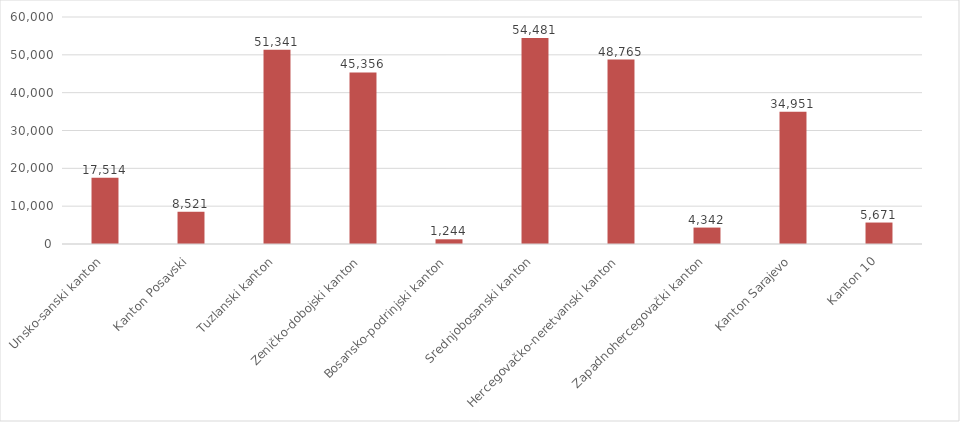
| Category | Series 1 |
|---|---|
| Unsko-sanski kanton | 17514 |
| Kanton Posavski | 8521 |
| Tuzlanski kanton | 51341 |
| Zeničko-dobojski kanton | 45356 |
| Bosansko-podrinjski kanton | 1244 |
| Srednjobosanski kanton | 54481 |
| Hercegovačko-neretvanski kanton | 48765 |
| Zapadnohercegovački kanton | 4342 |
| Kanton Sarajevo | 34951 |
| Kanton 10 | 5671 |